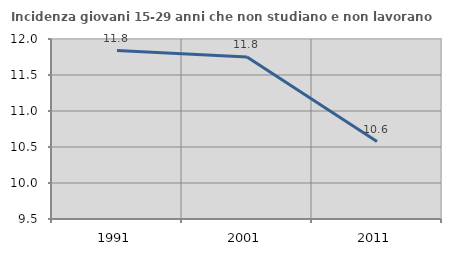
| Category | Incidenza giovani 15-29 anni che non studiano e non lavorano  |
|---|---|
| 1991.0 | 11.839 |
| 2001.0 | 11.751 |
| 2011.0 | 10.576 |